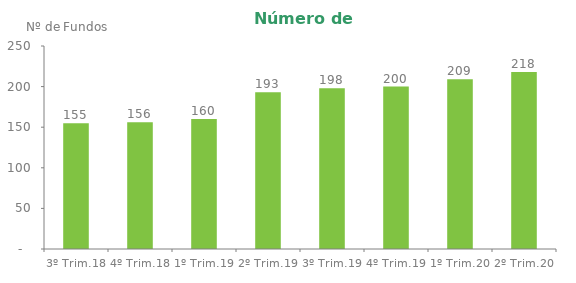
| Category | Series 0 |
|---|---|
| 3º Trim.18 | 155 |
| 4º Trim.18 | 156 |
| 1º Trim.19 | 160 |
| 2º Trim.19 | 193 |
| 3º Trim.19 | 198 |
| 4º Trim.19 | 200 |
| 1º Trim.20 | 209 |
| 2º Trim.20 | 218 |